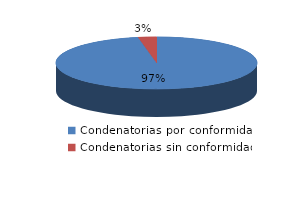
| Category | Series 0 |
|---|---|
| 0 | 495 |
| 1 | 15 |